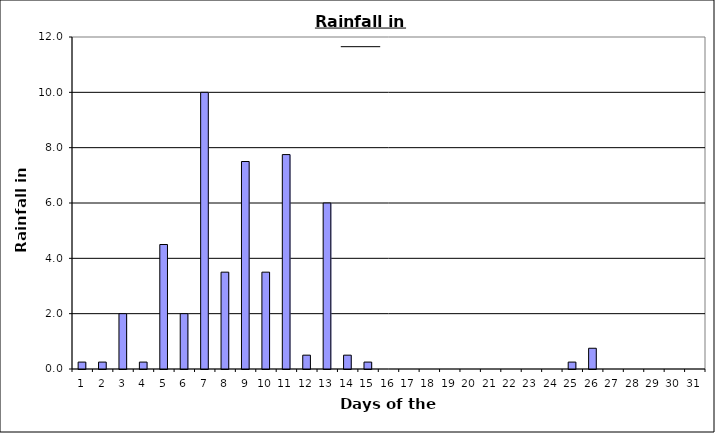
| Category | Series 0 |
|---|---|
| 0 | 0.25 |
| 1 | 0.25 |
| 2 | 2 |
| 3 | 0.25 |
| 4 | 4.5 |
| 5 | 2 |
| 6 | 10 |
| 7 | 3.5 |
| 8 | 7.5 |
| 9 | 3.5 |
| 10 | 7.75 |
| 11 | 0.5 |
| 12 | 6 |
| 13 | 0.5 |
| 14 | 0.25 |
| 15 | 0 |
| 16 | 0 |
| 17 | 0 |
| 18 | 0 |
| 19 | 0 |
| 20 | 0 |
| 21 | 0 |
| 22 | 0 |
| 23 | 0 |
| 24 | 0.25 |
| 25 | 0.75 |
| 26 | 0 |
| 27 | 0 |
| 28 | 0 |
| 29 | 0 |
| 30 | 0 |